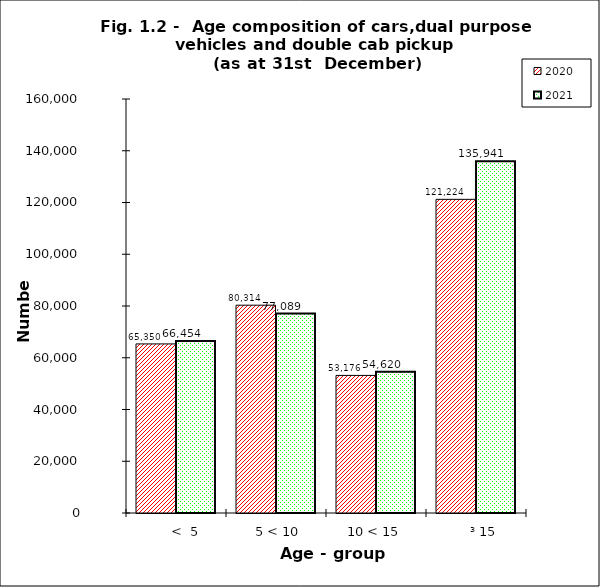
| Category | 2020 | 2021 |
|---|---|---|
|       <  5 | 65350 | 66454 |
|   5 < 10 | 80314 | 77089 |
| 10 < 15 | 53176 | 54620 |
|      ³ 15 | 121224 | 135941 |